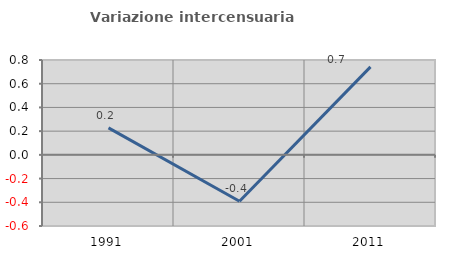
| Category | Variazione intercensuaria annua |
|---|---|
| 1991.0 | 0.227 |
| 2001.0 | -0.392 |
| 2011.0 | 0.742 |